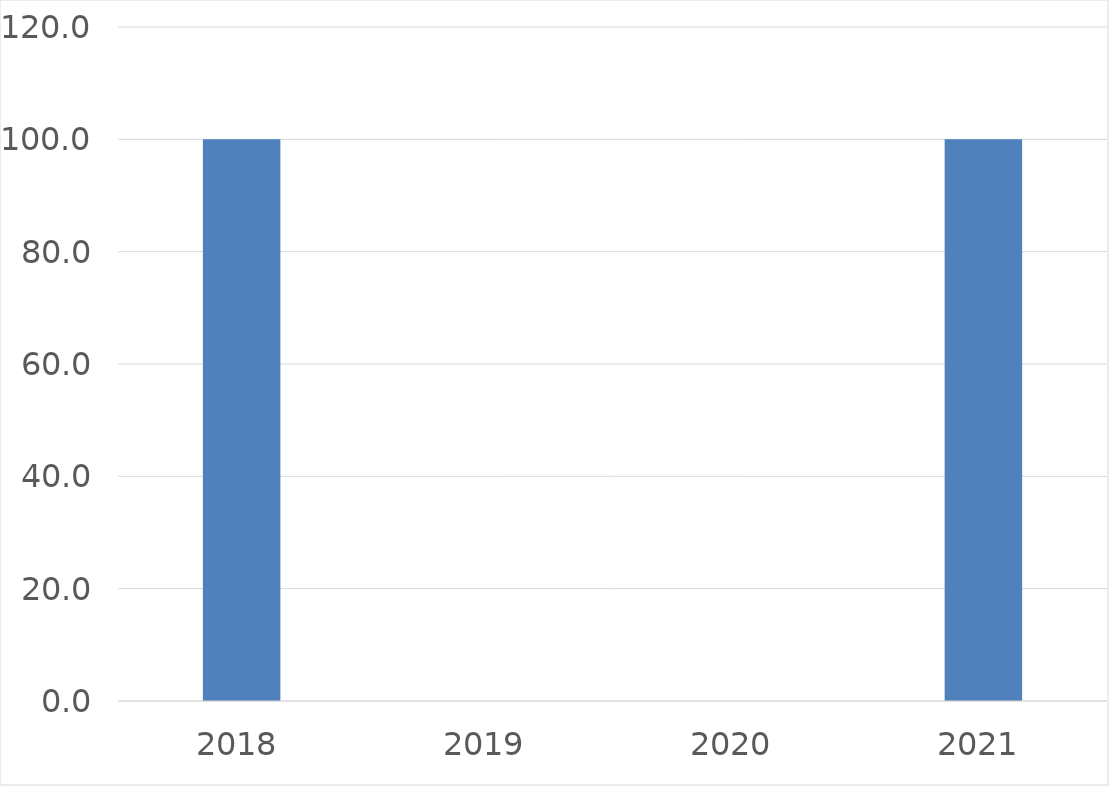
| Category | Series 0 |
|---|---|
| 2018 | 100 |
| 2019 | 0 |
| 2020 | 0 |
| 2021 | 100 |